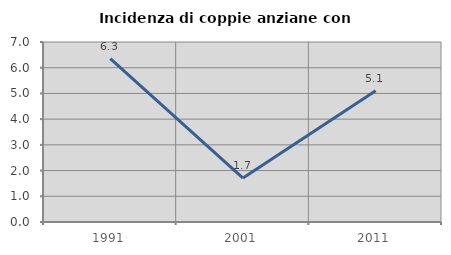
| Category | Incidenza di coppie anziane con figli |
|---|---|
| 1991.0 | 6.349 |
| 2001.0 | 1.709 |
| 2011.0 | 5.102 |